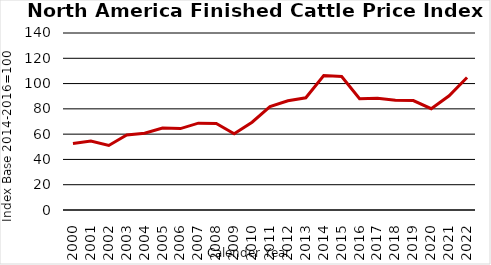
| Category | CA, MX, US |
|---|---|
| 2000.0 | 52.521 |
| 2001.0 | 54.539 |
| 2002.0 | 51.012 |
| 2003.0 | 59.406 |
| 2004.0 | 60.679 |
| 2005.0 | 64.797 |
| 2006.0 | 64.396 |
| 2007.0 | 68.681 |
| 2008.0 | 68.445 |
| 2009.0 | 60.331 |
| 2010.0 | 69.441 |
| 2011.0 | 81.841 |
| 2012.0 | 86.403 |
| 2013.0 | 88.773 |
| 2014.0 | 106.388 |
| 2015.0 | 105.537 |
| 2016.0 | 88.074 |
| 2017.0 | 88.319 |
| 2018.0 | 86.776 |
| 2019.0 | 86.516 |
| 2020.0 | 80.118 |
| 2021.0 | 90.321 |
| 2022.0 | 104.807 |